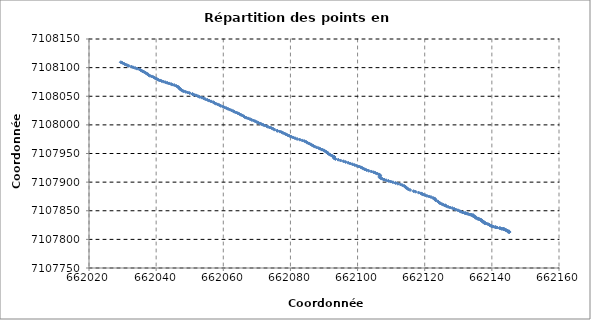
| Category | Series 0 |
|---|---|
| 662145.188 | 7107812.522 |
| 662144.905 | 7107813.035 |
| 662145.147 | 7107813.155 |
| 662144.977 | 7107813.779 |
| 662144.983 | 7107813.787 |
| 662145.084 | 7107814.076 |
| 662144.724 | 7107814.849 |
| 662144.57 | 7107815.313 |
| 662144.54 | 7107815.351 |
| 662144.184 | 7107816.17 |
| 662144.199 | 7107816.355 |
| 662143.978 | 7107816.856 |
| 662143.751 | 7107817.334 |
| 662143.647 | 7107817.685 |
| 662143.613 | 7107817.958 |
| 662142.975 | 7107818.32 |
| 662143.502 | 7107818.322 |
| 662143.29 | 7107818.453 |
| 662142.807 | 7107818.89 |
| 662142.24 | 7107819.656 |
| 662142.493 | 7107819.66 |
| 662141.545 | 7107820.684 |
| 662141.129 | 7107821.111 |
| 662141.125 | 7107821.126 |
| 662140.975 | 7107821.491 |
| 662140.42 | 7107822.288 |
| 662140.276 | 7107822.418 |
| 662140.009 | 7107823.17 |
| 662139.919 | 7107823.223 |
| 662139.695 | 7107823.81 |
| 662139.335 | 7107824.863 |
| 662139.112 | 7107825.931 |
| 662138.818 | 7107826.906 |
| 662138.348 | 7107827.607 |
| 662137.987 | 7107828.243 |
| 662137.793 | 7107828.282 |
| 662137.913 | 7107829.154 |
| 662137.471 | 7107830.022 |
| 662137.557 | 7107830.482 |
| 662137.475 | 7107830.545 |
| 662137.34 | 7107831.204 |
| 662137.441 | 7107831.212 |
| 662137.221 | 7107831.732 |
| 662136.977 | 7107832.228 |
| 662137.064 | 7107832.632 |
| 662136.89 | 7107833.156 |
| 662136.794 | 7107833.772 |
| 662136.681 | 7107834.51 |
| 662136.146 | 7107835.257 |
| 662136.33 | 7107835.277 |
| 662135.908 | 7107836.054 |
| 662135.758 | 7107836.054 |
| 662135.748 | 7107836.734 |
| 662135.287 | 7107837.563 |
| 662135.172 | 7107837.918 |
| 662135.188 | 7107838.077 |
| 662135.17 | 7107838.756 |
| 662134.941 | 7107839.691 |
| 662134.787 | 7107840.03 |
| 662134.773 | 7107840.035 |
| 662134.613 | 7107840.44 |
| 662134.462 | 7107840.849 |
| 662134.423 | 7107841.113 |
| 662134.491 | 7107841.4 |
| 662134.365 | 7107842.122 |
| 662134.418 | 7107842.322 |
| 662134.067 | 7107842.336 |
| 662133.83 | 7107842.76 |
| 662133.378 | 7107843.346 |
| 662133.73 | 7107843.36 |
| 662132.938 | 7107844.289 |
| 662132.597 | 7107844.967 |
| 662132.121 | 7107845.62 |
| 662132.129 | 7107845.703 |
| 662131.988 | 7107846.028 |
| 662131.399 | 7107846.941 |
| 662130.892 | 7107848.126 |
| 662130.444 | 7107849.445 |
| 662129.902 | 7107850.827 |
| 662129.248 | 7107852.115 |
| 662128.801 | 7107853.368 |
| 662128.212 | 7107854.596 |
| 662127.585 | 7107855.659 |
| 662126.981 | 7107856.777 |
| 662126.423 | 7107857.998 |
| 662126.043 | 7107859.131 |
| 662126.131 | 7107859.593 |
| 662125.562 | 7107860.47 |
| 662125.129 | 7107861.622 |
| 662124.618 | 7107862.827 |
| 662124.405 | 7107864.086 |
| 662124.115 | 7107865.242 |
| 662123.894 | 7107866.33 |
| 662123.318 | 7107868.178 |
| 662123.168 | 7107869.201 |
| 662123.071 | 7107870.294 |
| 662122.903 | 7107871.506 |
| 662122.491 | 7107872.326 |
| 662121.87 | 7107873.993 |
| 662121.33 | 7107874.932 |
| 662120.671 | 7107875.937 |
| 662120.152 | 7107877.083 |
| 662119.659 | 7107878.169 |
| 662119.33 | 7107879.18 |
| 662119.1 | 7107879.505 |
| 662118.869 | 7107880.325 |
| 662118.198 | 7107881.62 |
| 662117.284 | 7107883.251 |
| 662116.681 | 7107884.177 |
| 662115.642 | 7107886.306 |
| 662115.093 | 7107887.557 |
| 662114.803 | 7107888.995 |
| 662114.426 | 7107890.438 |
| 662114.251 | 7107891.86 |
| 662113.892 | 7107893.302 |
| 662113.326 | 7107894.649 |
| 662112.775 | 7107896.026 |
| 662111.997 | 7107897.229 |
| 662111.282 | 7107898.46 |
| 662110.545 | 7107899.808 |
| 662109.874 | 7107900.996 |
| 662109.2 | 7107902.143 |
| 662108.493 | 7107903.266 |
| 662107.894 | 7107904.505 |
| 662107.377 | 7107905.764 |
| 662106.808 | 7107907.015 |
| 662106.616 | 7107908.335 |
| 662106.571 | 7107909.653 |
| 662106.745 | 7107910.897 |
| 662106.691 | 7107912.25 |
| 662106.363 | 7107913.497 |
| 662105.863 | 7107914.804 |
| 662105.333 | 7107916.089 |
| 662104.766 | 7107917.329 |
| 662104.097 | 7107918.605 |
| 662103.324 | 7107919.839 |
| 662102.661 | 7107921.097 |
| 662102.121 | 7107922.374 |
| 662101.751 | 7107923.603 |
| 662101.372 | 7107924.865 |
| 662100.92 | 7107926.09 |
| 662100.391 | 7107927.292 |
| 662099.741 | 7107928.569 |
| 662099.136 | 7107929.894 |
| 662098.456 | 7107931.237 |
| 662097.8 | 7107932.578 |
| 662097.2 | 7107933.866 |
| 662096.463 | 7107935.169 |
| 662095.787 | 7107936.413 |
| 662094.933 | 7107937.79 |
| 662094.24 | 7107939.151 |
| 662093.391 | 7107940.367 |
| 662093.029 | 7107941.617 |
| 662092.977 | 7107942.824 |
| 662093.083 | 7107943.824 |
| 662093.042 | 7107943.977 |
| 662092.543 | 7107945.315 |
| 662092.26 | 7107946.558 |
| 662091.846 | 7107947.863 |
| 662091.356 | 7107949.287 |
| 662091.116 | 7107950.563 |
| 662090.961 | 7107951.811 |
| 662090.632 | 7107953.107 |
| 662090.226 | 7107954.434 |
| 662089.879 | 7107955.598 |
| 662089.432 | 7107956.815 |
| 662088.897 | 7107958.127 |
| 662088.424 | 7107959.441 |
| 662087.778 | 7107960.712 |
| 662087.214 | 7107962.054 |
| 662086.846 | 7107963.393 |
| 662086.361 | 7107964.8 |
| 662085.979 | 7107966.106 |
| 662085.549 | 7107967.505 |
| 662085.066 | 7107968.796 |
| 662084.725 | 7107970.19 |
| 662084.173 | 7107971.586 |
| 662083.545 | 7107972.826 |
| 662082.801 | 7107974.175 |
| 662081.997 | 7107975.385 |
| 662081.373 | 7107976.64 |
| 662080.821 | 7107977.987 |
| 662080.267 | 7107979.366 |
| 662079.696 | 7107980.753 |
| 662079.137 | 7107982.147 |
| 662078.674 | 7107983.457 |
| 662078.277 | 7107984.76 |
| 662077.781 | 7107985.986 |
| 662077.358 | 7107987.277 |
| 662076.857 | 7107988.285 |
| 662076.11 | 7107989.689 |
| 662076.076 | 7107989.745 |
| 662075.27 | 7107991.643 |
| 662074.85 | 7107993.096 |
| 662074.359 | 7107994.426 |
| 662073.872 | 7107995.392 |
| 662073.341 | 7107996.566 |
| 662072.922 | 7107997.644 |
| 662072.299 | 7107998.824 |
| 662071.878 | 7108000.104 |
| 662071.384 | 7108001.324 |
| 662070.934 | 7108002.475 |
| 662070.455 | 7108003.725 |
| 662069.98 | 7108005.014 |
| 662069.487 | 7108006.281 |
| 662069.024 | 7108007.553 |
| 662068.458 | 7108008.708 |
| 662067.948 | 7108010.129 |
| 662067.415 | 7108011.323 |
| 662066.869 | 7108012.492 |
| 662066.33 | 7108013.741 |
| 662066.088 | 7108015.008 |
| 662065.69 | 7108016.443 |
| 662065.269 | 7108017.66 |
| 662064.816 | 7108018.97 |
| 662064.312 | 7108020.375 |
| 662063.868 | 7108021.568 |
| 662063.331 | 7108022.885 |
| 662062.941 | 7108024.066 |
| 662062.434 | 7108025.429 |
| 662061.902 | 7108026.715 |
| 662061.422 | 7108028.007 |
| 662060.893 | 7108029.298 |
| 662060.357 | 7108030.593 |
| 662059.913 | 7108031.873 |
| 662059.274 | 7108033.149 |
| 662058.819 | 7108034.513 |
| 662058.322 | 7108035.798 |
| 662057.787 | 7108037.066 |
| 662057.355 | 7108038.35 |
| 662056.982 | 7108039.72 |
| 662056.368 | 7108041.005 |
| 662055.803 | 7108042.344 |
| 662055.296 | 7108043.606 |
| 662054.637 | 7108044.917 |
| 662054.155 | 7108046.297 |
| 662053.578 | 7108047.63 |
| 662052.899 | 7108048.983 |
| 662052.415 | 7108050.377 |
| 662051.811 | 7108051.664 |
| 662051.248 | 7108052.741 |
| 662050.879 | 7108053.585 |
| 662050.8 | 7108053.808 |
| 662049.979 | 7108055.592 |
| 662049.397 | 7108056.62 |
| 662048.811 | 7108057.719 |
| 662048.168 | 7108058.637 |
| 662047.857 | 7108059.637 |
| 662047.457 | 7108061.205 |
| 662047.2 | 7108062.176 |
| 662047.091 | 7108063.176 |
| 662046.841 | 7108064.462 |
| 662046.64 | 7108065.655 |
| 662046.448 | 7108066.88 |
| 662046.037 | 7108067.974 |
| 662045.402 | 7108069.527 |
| 662044.814 | 7108070.376 |
| 662044.431 | 7108071.4 |
| 662043.853 | 7108072.407 |
| 662043.307 | 7108073.47 |
| 662042.734 | 7108074.457 |
| 662042.176 | 7108075.514 |
| 662041.626 | 7108076.557 |
| 662041.158 | 7108077.57 |
| 662040.692 | 7108078.654 |
| 662040.309 | 7108079.778 |
| 662039.934 | 7108080.989 |
| 662039.574 | 7108082.208 |
| 662039.199 | 7108083.398 |
| 662038.682 | 7108084.624 |
| 662038.153 | 7108085.75 |
| 662037.744 | 7108086.974 |
| 662037.55 | 7108088.302 |
| 662037.23 | 7108089.523 |
| 662036.876 | 7108090.881 |
| 662036.476 | 7108092.145 |
| 662036.066 | 7108093.321 |
| 662035.725 | 7108094.61 |
| 662035.336 | 7108095.833 |
| 662034.979 | 7108097.149 |
| 662034.324 | 7108098.217 |
| 662033.754 | 7108099.366 |
| 662033.164 | 7108100.487 |
| 662032.657 | 7108101.706 |
| 662031.858 | 7108102.988 |
| 662031.399 | 7108104.095 |
| 662030.949 | 7108105.297 |
| 662030.587 | 7108106.338 |
| 662029.954 | 7108108.238 |
| 662029.479 | 7108109.437 |